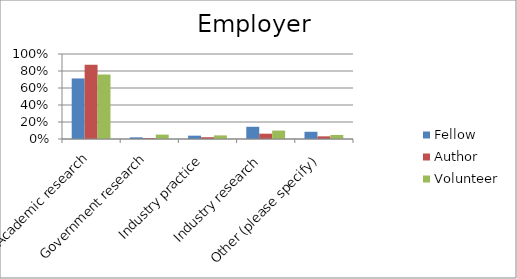
| Category | Fellow | Author | Volunteer |
|---|---|---|---|
| Academic research | 0.712 | 0.875 | 0.759 |
| Government research | 0.02 | 0.01 | 0.052 |
| Industry practice | 0.039 | 0.021 | 0.042 |
| Industry research | 0.144 | 0.062 | 0.099 |
| Other (please specify) | 0.085 | 0.031 | 0.047 |